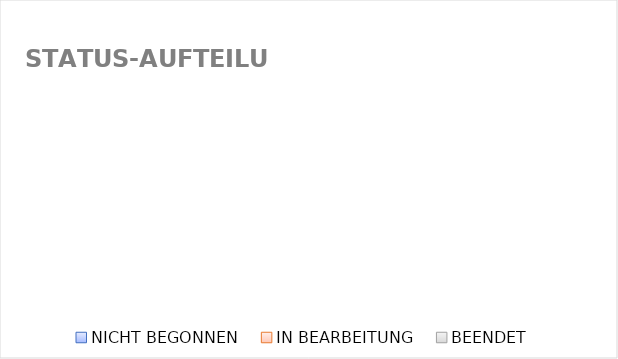
| Category | Series 0 |
|---|---|
| NICHT BEGONNEN | 0 |
| IN BEARBEITUNG | 0 |
| BEENDET | 0 |